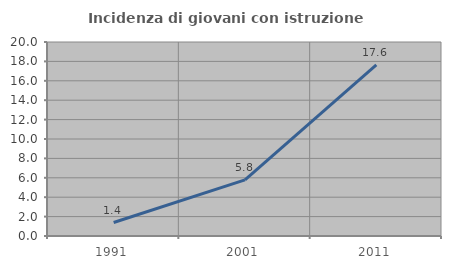
| Category | Incidenza di giovani con istruzione universitaria |
|---|---|
| 1991.0 | 1.389 |
| 2001.0 | 5.785 |
| 2011.0 | 17.647 |